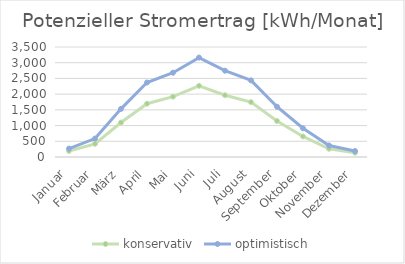
| Category | konservativ | optimistisch |
|---|---|---|
| Januar | 191.101 | 266.979 |
| Februar | 418.948 | 585.295 |
| März | 1096.188 | 1531.438 |
| April | 1696.301 | 2369.832 |
| Mai | 1919.607 | 2681.803 |
| Juni | 2264.137 | 3163.133 |
| Juli | 1965.227 | 2745.538 |
| August | 1745.596 | 2438.7 |
| September | 1145.295 | 1600.045 |
| Oktober | 654.36 | 914.179 |
| November | 262.289 | 366.433 |
| Dezember | 135.552 | 189.373 |